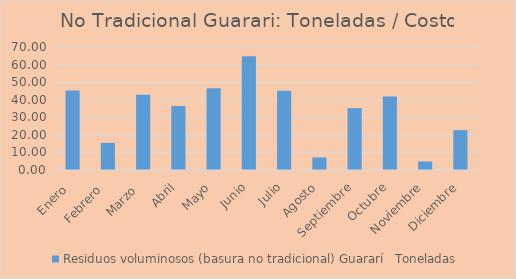
| Category | Residuos voluminosos (basura no tradicional) Guararí  |
|---|---|
| Enero  | 45.19 |
| Febrero  | 15.43 |
| Marzo  | 42.8 |
| Abril | 36.49 |
| Mayo | 46.58 |
| Junio | 64.79 |
| Julio | 45.13 |
| Agosto | 7.13 |
| Septiembre | 35.22 |
| Octubre | 41.89 |
| Noviembre | 4.85 |
| Diciembre | 22.67 |